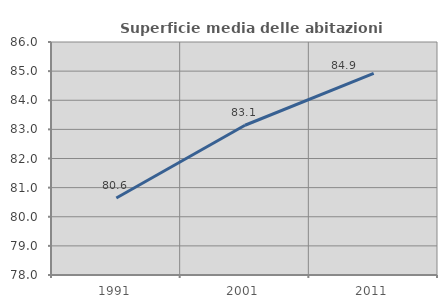
| Category | Superficie media delle abitazioni occupate |
|---|---|
| 1991.0 | 80.645 |
| 2001.0 | 83.142 |
| 2011.0 | 84.926 |